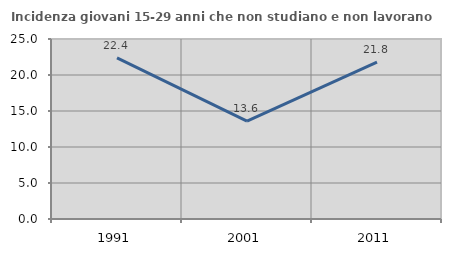
| Category | Incidenza giovani 15-29 anni che non studiano e non lavorano  |
|---|---|
| 1991.0 | 22.378 |
| 2001.0 | 13.594 |
| 2011.0 | 21.772 |